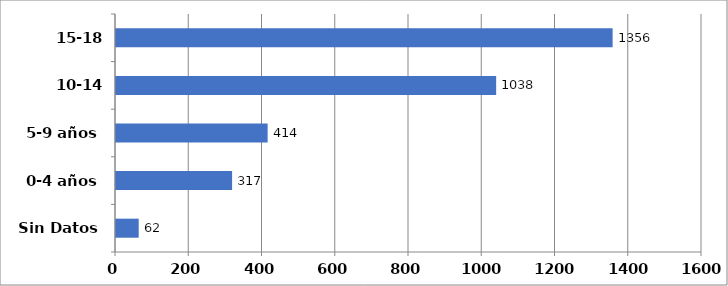
| Category | Series 0 |
|---|---|
| Sin Datos | 62 |
| 0-4 años | 317 |
| 5-9 años | 414 |
| 10-14 años | 1038 |
| 15-18 años | 1356 |